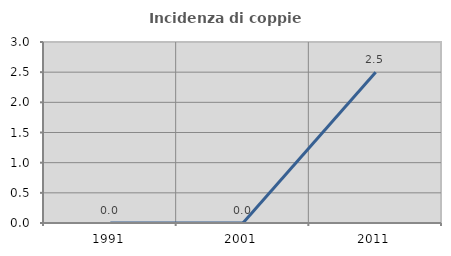
| Category | Incidenza di coppie miste |
|---|---|
| 1991.0 | 0 |
| 2001.0 | 0 |
| 2011.0 | 2.5 |